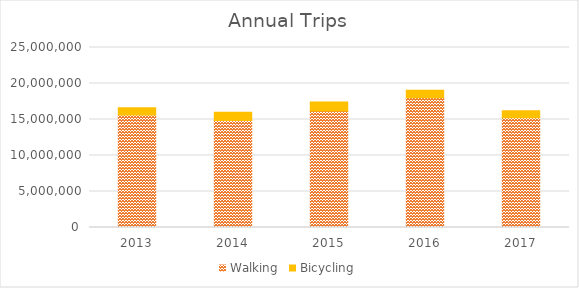
| Category | Walking | Bicycling |
|---|---|---|
| 2013 | 15638850 | 1000889.627 |
| 2014 | 14852999 | 1157197.63 |
| 2015 | 16182080 | 1231941.783 |
| 2016 | 18017867 | 1061441.553 |
| 2017 | 15233680 | 976917.026 |